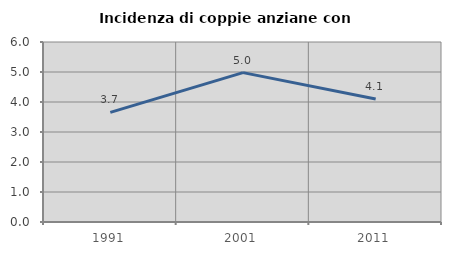
| Category | Incidenza di coppie anziane con figli |
|---|---|
| 1991.0 | 3.653 |
| 2001.0 | 4.979 |
| 2011.0 | 4.098 |